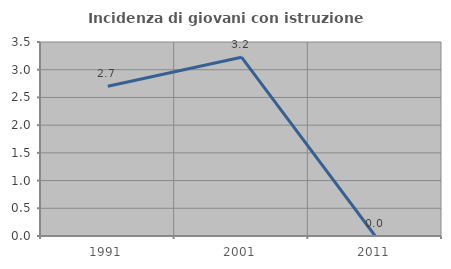
| Category | Incidenza di giovani con istruzione universitaria |
|---|---|
| 1991.0 | 2.703 |
| 2001.0 | 3.226 |
| 2011.0 | 0 |